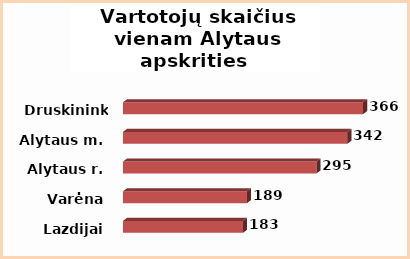
| Category | Series 0 |
|---|---|
| Lazdijai | 183 |
| Varėna | 189 |
| Alytaus r. | 295 |
| Alytaus m. | 342 |
| Druskininkai | 366 |